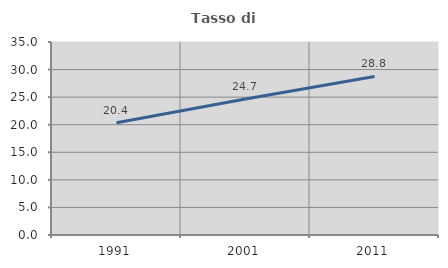
| Category | Tasso di occupazione   |
|---|---|
| 1991.0 | 20.358 |
| 2001.0 | 24.66 |
| 2011.0 | 28.755 |